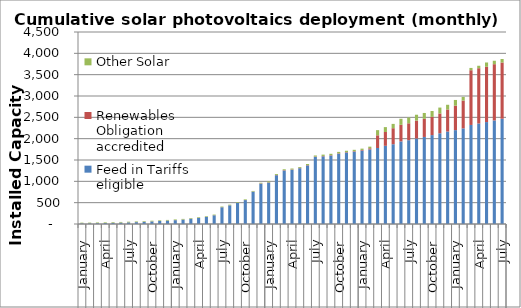
| Category | Feed in Tariffs eligible | Renewables Obligation accredited | Other Solar |
|---|---|---|---|
| 0 | 14.962 | 2.081 | 14.6 |
| 1 | 16.347 | 2.09 | 14.6 |
| 2 | 18.868 | 2.113 | 14.6 |
| 3 | 21.506 | 2.135 | 14.6 |
| 4 | 25.806 | 2.147 | 14.6 |
| 5 | 31.384 | 2.165 | 14.6 |
| 6 | 37.287 | 2.183 | 14.6 |
| 7 | 43.082 | 2.19 | 14.6 |
| 8 | 50.612 | 2.196 | 14.6 |
| 9 | 59.987 | 2.207 | 14.6 |
| 10 | 70.571 | 2.219 | 14.6 |
| 11 | 78.599 | 2.231 | 14.6 |
| 12 | 89.794 | 2.231 | 14.6 |
| 13 | 102.733 | 2.231 | 14.6 |
| 14 | 122.538 | 2.248 | 14.6 |
| 15 | 141.7 | 2.256 | 14.6 |
| 16 | 165.21 | 2.294 | 14.6 |
| 17 | 203.972 | 2.327 | 14.6 |
| 18 | 392.006 | 2.344 | 14.6 |
| 19 | 436.755 | 2.374 | 14.6 |
| 20 | 493.164 | 2.427 | 14.6 |
| 21 | 560.377 | 2.519 | 14.6 |
| 22 | 757.385 | 2.615 | 14.6 |
| 23 | 945.047 | 7.256 | 14.6 |
| 24 | 969.474 | 7.387 | 20.6 |
| 25 | 1143.044 | 7.442 | 20.6 |
| 26 | 1253.799 | 8.415 | 20.6 |
| 27 | 1271.211 | 8.505 | 20.6 |
| 28 | 1307.234 | 8.56 | 20.6 |
| 29 | 1372.167 | 8.662 | 26.1 |
| 30 | 1571.187 | 8.74 | 26.1 |
| 31 | 1585.735 | 9.137 | 31.5 |
| 32 | 1604.448 | 9.518 | 31.5 |
| 33 | 1648.424 | 10.238 | 31.5 |
| 34 | 1674.357 | 11.026 | 31.5 |
| 35 | 1695.894 | 11.546 | 31.5 |
| 36 | 1720.51 | 14.738 | 31.5 |
| 37 | 1748.207 | 26.37 | 38.22 |
| 38 | 1781.863 | 297.055 | 120.836 |
| 39 | 1832.652 | 323.873 | 114.33 |
| 40 | 1869.338 | 375.856 | 101.196 |
| 41 | 1936.035 | 388.684 | 141.9 |
| 42 | 1964.226 | 395.708 | 136.849 |
| 43 | 2004.124 | 419.309 | 137.447 |
| 44 | 2040.065 | 424.497 | 137.744 |
| 45 | 2083.539 | 426.87 | 138.06 |
| 46 | 2126.36 | 463.663 | 138.884 |
| 47 | 2166.848 | 516.716 | 110.721 |
| 48 | 2200.171 | 573.992 | 132.855 |
| 49 | 2241.142 | 651.996 | 86.007 |
| 50 | 2321.465 | 1282.715 | 53.547 |
| 51 | 2355.75 | 1295.554 | 57.361 |
| 52 | 2389.051 | 1296.243 | 100.272 |
| 53 | 2427.141 | 1318.424 | 80.393 |
| 54 | 2466.279 | 1318.424 | 82.271 |